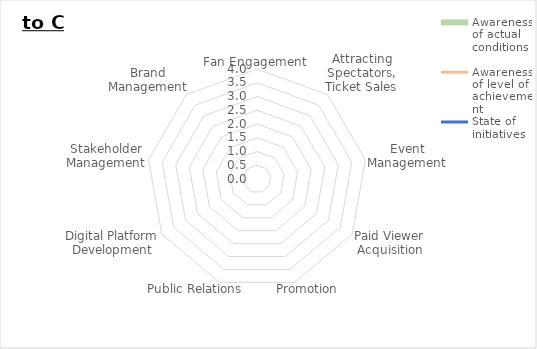
| Category | Awareness of actual conditions | Awareness of level of achievement | State of initiatives |
|---|---|---|---|
| 0 | 0 | 0 | 0 |
| 1 | 0 | 0 | 0 |
| 2 | 0 | 0 | 0 |
| 3 | 0 | 0 | 0 |
| 4 | 0 | 0 | 0 |
| 5 | 0 | 0 | 0 |
| 6 | 0 | 0 | 0 |
| 7 | 0 | 0 | 0 |
| 8 | 0 | 0 | 0 |